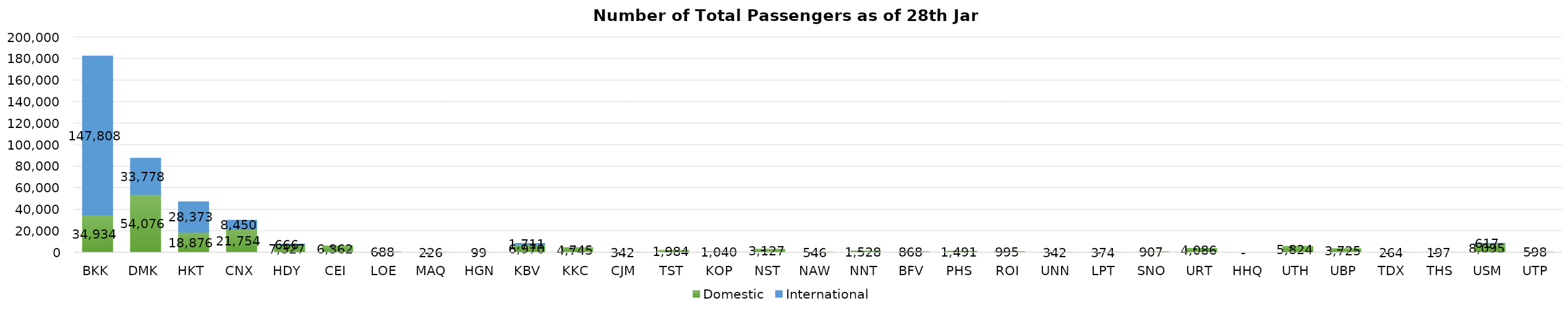
| Category | Domestic | International |
|---|---|---|
| BKK | 34934 | 147808 |
| DMK | 54076 | 33778 |
| HKT | 18876 | 28373 |
| CNX | 21754 | 8450 |
| HDY | 7327 | 666 |
| CEI | 6362 | 0 |
| LOE | 688 | 0 |
| MAQ | 226 | 0 |
| HGN | 99 | 0 |
| KBV | 6970 | 1711 |
| KKC | 4745 | 0 |
| CJM | 342 | 0 |
| TST | 1984 | 0 |
| KOP | 1040 | 0 |
| NST | 3127 | 0 |
| NAW | 546 | 0 |
| NNT | 1528 | 0 |
| BFV | 868 | 0 |
| PHS | 1491 | 0 |
| ROI | 995 | 0 |
| UNN | 342 | 0 |
| LPT | 374 | 0 |
| SNO | 907 | 0 |
| URT | 4086 | 0 |
| HHQ | 0 | 0 |
| UTH | 5824 | 0 |
| UBP | 3725 | 0 |
| TDX | 264 | 0 |
| THS | 197 | 0 |
| USM | 8095 | 617 |
| UTP | 598 | 0 |